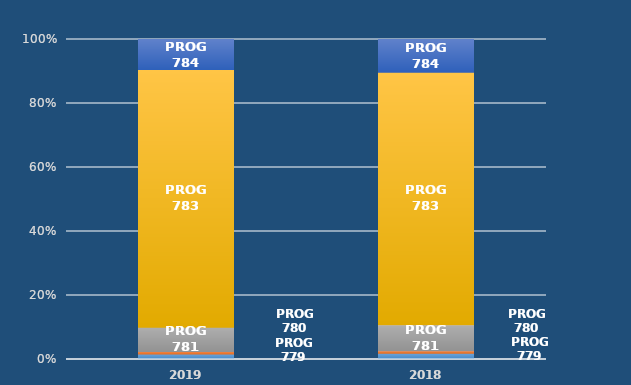
| Category | PROG 779 | PROG 780 | PROG 781 | PROG 783 | PROG 784 |
|---|---|---|---|---|---|
| 2019.0 | 0.017 | 0.008 | 0.076 | 0.805 | 0.094 |
| 2018.0 | 0.019 | 0.008 | 0.081 | 0.789 | 0.102 |